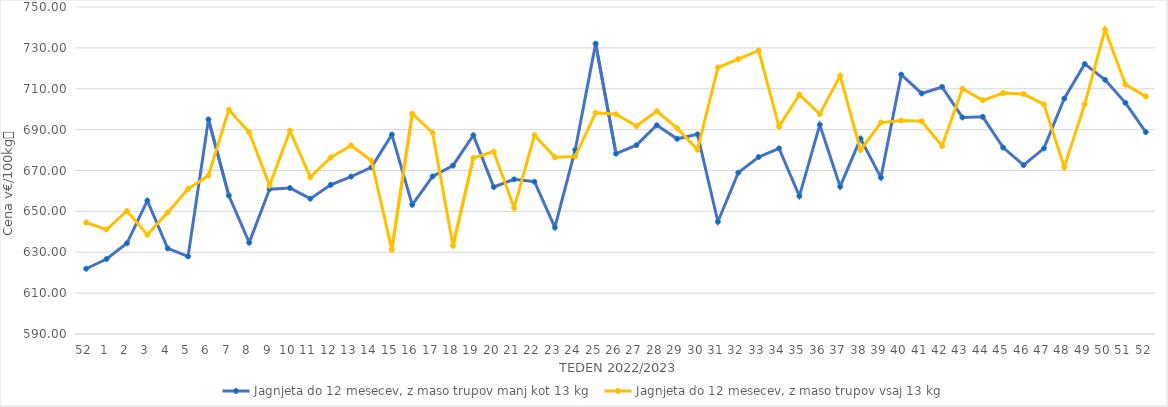
| Category | Jagnjeta do 12 mesecev, z maso trupov manj kot 13 kg | Jagnjeta do 12 mesecev, z maso trupov vsaj 13 kg |
|---|---|---|
| 52.0 | 621.93 | 644.53 |
| 1.0 | 626.7 | 641.12 |
| 2.0 | 634.39 | 650.2 |
| 3.0 | 655.23 | 638.53 |
| 4.0 | 631.88 | 649.48 |
| 5.0 | 627.99 | 660.95 |
| 6.0 | 695.01 | 667.54 |
| 7.0 | 657.72 | 699.7 |
| 8.0 | 634.72 | 688.66 |
| 9.0 | 660.86 | 662.64 |
| 10.0 | 661.43 | 689.44 |
| 11.0 | 656.22 | 666.74 |
| 12.0 | 662.99 | 676.37 |
| 13.0 | 667.01 | 682.23 |
| 14.0 | 671.54 | 674.78 |
| 15.0 | 687.53 | 631.19 |
| 16.0 | 653.23 | 697.8 |
| 17.0 | 667.12 | 688.5 |
| 18.0 | 672.4 | 633.15 |
| 19.0 | 687.24 | 676.12 |
| 20.0 | 661.94 | 679.25 |
| 21.0 | 665.67 | 651.69 |
| 22.0 | 664.51 | 687.26 |
| 23.0 | 642.13 | 676.52 |
| 24.0 | 680.19 | 676.83 |
| 25.0 | 732.08 | 698.25 |
| 26.0 | 678.25 | 697.54 |
| 27.0 | 682.39 | 691.8 |
| 28.0 | 692.13 | 699 |
| 29.0 | 685.5 | 690.7 |
| 30.0 | 687.69 | 680.17 |
| 31.0 | 644.94 | 720.34 |
| 32.0 | 668.95 | 724.52 |
| 33.0 | 676.59 | 728.72 |
| 34.0 | 680.83 | 691.49 |
| 35.0 | 657.49 | 707.11 |
| 36.0 | 692.38 | 697.6 |
| 37.0 | 662.09 | 716.35 |
| 38.0 | 685.6 | 680.02 |
| 39.0 | 666.53 | 693.43 |
| 40.0 | 716.9 | 694.47 |
| 41.0 | 707.69 | 694.11 |
| 42.0 | 710.88 | 682 |
| 43.0 | 695.97 | 710.04 |
| 44.0 | 696.26 | 704.35 |
| 45.0 | 681.23 | 707.91 |
| 46.0 | 672.64 | 707.39 |
| 47.0 | 680.87 | 702.35 |
| 48.0 | 705.21 | 671.66 |
| 49.0 | 722.14 | 702.38 |
| 50.0 | 714.37 | 738.98 |
| 51.0 | 703.11 | 712.07 |
| 52.0 | 688.8 | 706.25 |